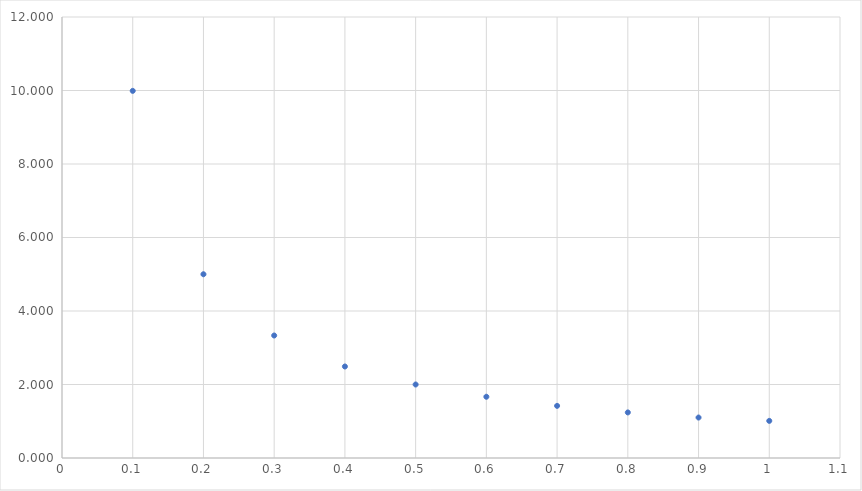
| Category | y |
|---|---|
| 0.1 | 9.99 |
| 0.2 | 5 |
| 0.30000000000000004 | 3.333 |
| 0.4 | 2.49 |
| 0.5 | 2 |
| 0.6 | 1.667 |
| 0.7 | 1.419 |
| 0.7999999999999999 | 1.24 |
| 0.8999999999999999 | 1.101 |
| 0.9999999999999999 | 1.01 |